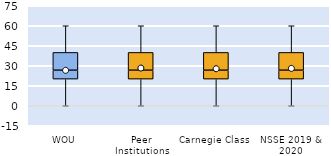
| Category | 25th | 50th | 75th |
|---|---|---|---|
| WOU | 20 | 6.667 | 13.333 |
| Peer Institutions | 20 | 6.667 | 13.333 |
| Carnegie Class | 20 | 6.667 | 13.333 |
| NSSE 2019 & 2020 | 20 | 6.667 | 13.333 |